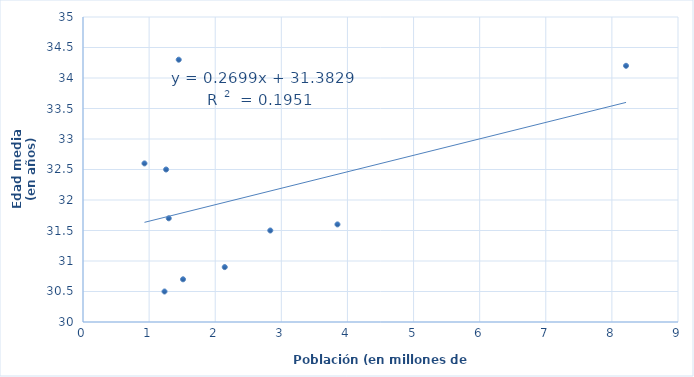
| Category | Edad media (en años) |
|---|---|
| 2.833 | 31.5 |
| 1.233 | 30.5 |
| 2.144 | 30.9 |
| 3.849 | 31.6 |
| 8.214 | 34.2 |
| 1.448 | 34.3 |
| 1.513 | 30.7 |
| 1.297 | 31.7 |
| 1.257 | 32.5 |
| 0.93 | 32.6 |